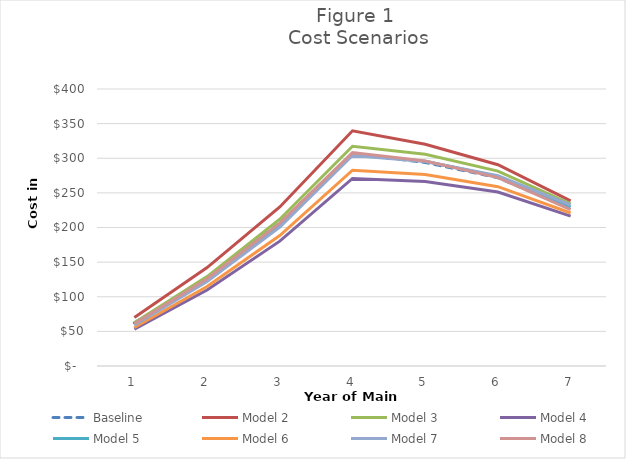
| Category | Baseline | Model 2 | Model 3 | Model 4 | Model 5 | Model 6 | Model 7 | Model 8 |
|---|---|---|---|---|---|---|---|---|
| 0 | 62.335 | 70.007 | 62.295 | 53.18 | 59.961 | 55.514 | 59.006 | 60.91 |
| 1 | 126.555 | 142.105 | 129.166 | 109.745 | 124.197 | 114.713 | 122.149 | 125.918 |
| 2 | 206.411 | 229.722 | 211.979 | 180.262 | 203.875 | 188.366 | 200.501 | 206.22 |
| 3 | 306.772 | 339.644 | 317.37 | 270.884 | 305.504 | 282.749 | 303.941 | 308.22 |
| 4 | 293.901 | 320.123 | 305.706 | 266.281 | 295.621 | 276.365 | 295.187 | 296.026 |
| 5 | 271.922 | 290.663 | 281.449 | 251.191 | 273.694 | 258.946 | 274.725 | 272.038 |
| 6 | 227.37 | 238.392 | 234.009 | 216.374 | 229.453 | 220.93 | 232.507 | 225.781 |